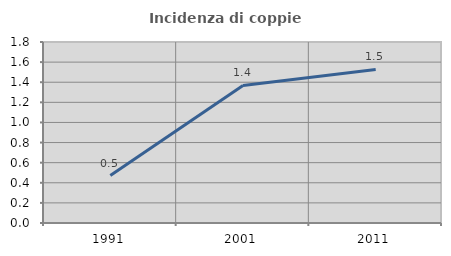
| Category | Incidenza di coppie miste |
|---|---|
| 1991.0 | 0.472 |
| 2001.0 | 1.368 |
| 2011.0 | 1.528 |